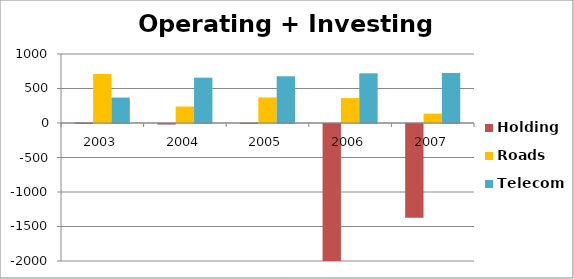
| Category | Holding | Roads | Telecom |
|---|---|---|---|
| 2003.0 | 8 | 710 | 369 |
| 2004.0 | -8 | 239 | 657 |
| 2005.0 | 4 | 370 | 677 |
| 2006.0 | -2473 | 361 | 720 |
| 2007.0 | -1357 | 136 | 725 |